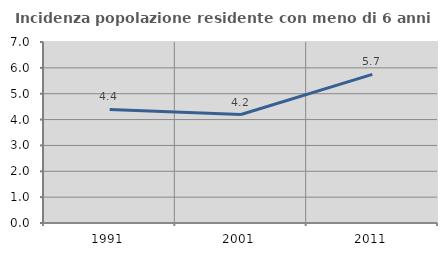
| Category | Incidenza popolazione residente con meno di 6 anni |
|---|---|
| 1991.0 | 4.391 |
| 2001.0 | 4.195 |
| 2011.0 | 5.749 |